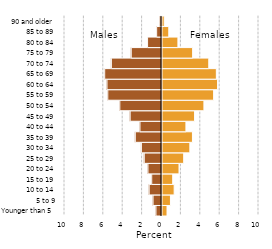
| Category | Series 0 |
|---|---|
| Younger than 5 | 0.518 |
| 5 to 9 | 0.871 |
| 10 to 14 | 1.254 |
| 15 to 19 | 1.105 |
| 20 to 24 | 1.754 |
| 25 to 29 | 2.237 |
| 30 to 34 | 2.871 |
| 35 to 39 | 3.138 |
| 40 to 44 | 2.467 |
| 45 to 49 | 3.359 |
| 50 to 54 | 4.321 |
| 55 to 59 | 5.323 |
| 60 to 64 | 5.731 |
| 65 to 69 | 5.603 |
| 70 to 74 | 4.822 |
| 75 to 79 | 3.158 |
| 80 to 84 | 1.641 |
| 85 to 89 | 0.7 |
| 90 and older | 0.233 |